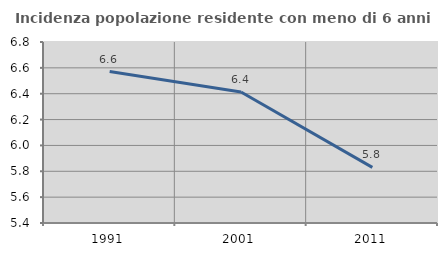
| Category | Incidenza popolazione residente con meno di 6 anni |
|---|---|
| 1991.0 | 6.571 |
| 2001.0 | 6.414 |
| 2011.0 | 5.831 |